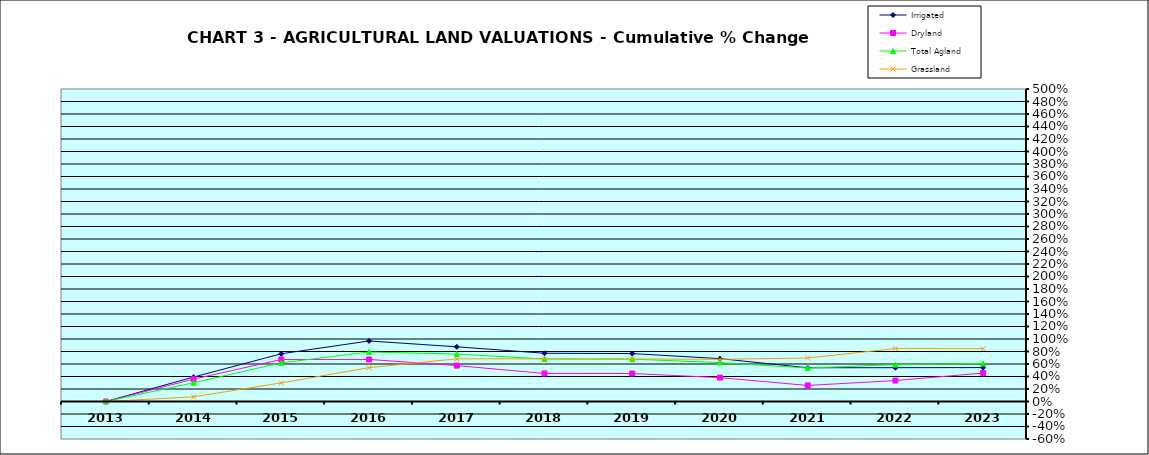
| Category | Irrigated | Dryland | Total Agland | Grassland |
|---|---|---|---|---|
| 2013.0 | 0 | 0 | 0 | 0 |
| 2014.0 | 0.391 | 0.358 | 0.3 | 0.075 |
| 2015.0 | 0.764 | 0.672 | 0.619 | 0.298 |
| 2016.0 | 0.969 | 0.673 | 0.792 | 0.541 |
| 2017.0 | 0.875 | 0.574 | 0.759 | 0.683 |
| 2018.0 | 0.772 | 0.449 | 0.68 | 0.682 |
| 2019.0 | 0.767 | 0.448 | 0.677 | 0.68 |
| 2020.0 | 0.686 | 0.382 | 0.623 | 0.675 |
| 2021.0 | 0.54 | 0.257 | 0.535 | 0.696 |
| 2022.0 | 0.541 | 0.335 | 0.59 | 0.847 |
| 2023.0 | 0.543 | 0.455 | 0.608 | 0.845 |